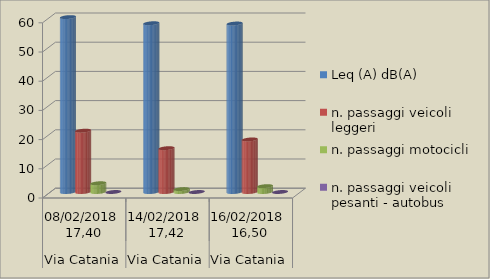
| Category | Leq (A) dB(A) | n. passaggi veicoli leggeri  | n. passaggi motocicli | n. passaggi veicoli pesanti - autobus  |
|---|---|---|---|---|
| 0 | 59.9 | 21 | 3 | 0 |
| 1 | 57.8 | 15 | 1 | 0 |
| 2 | 57.7 | 18 | 2 | 0 |